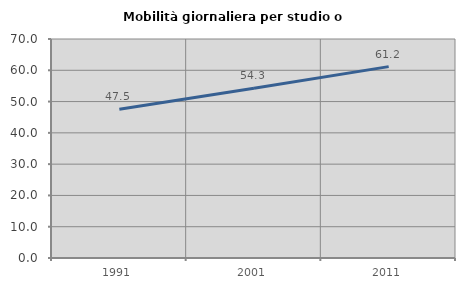
| Category | Mobilità giornaliera per studio o lavoro |
|---|---|
| 1991.0 | 47.541 |
| 2001.0 | 54.288 |
| 2011.0 | 61.175 |